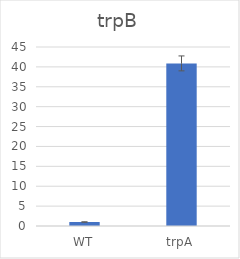
| Category | Series 0 |
|---|---|
| WT | 1.002 |
| trpA | 40.879 |